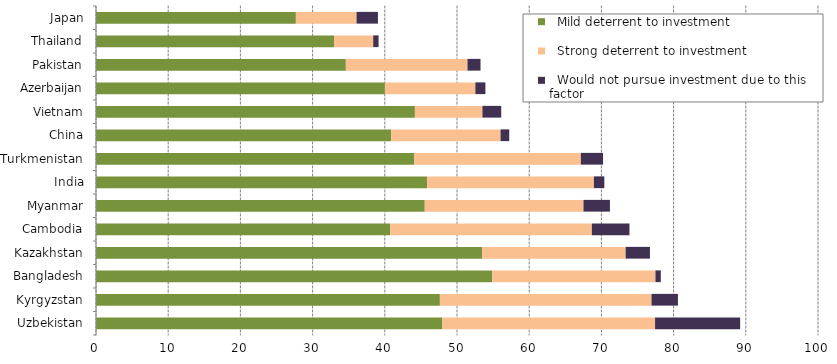
| Category |   Mild deterrent to investment |   Strong deterrent to investment |   Would not pursue investment due to this factor |
|---|---|---|---|
| Uzbekistan | 47.976 | 29.459 | 11.783 |
| Kyrgyzstan | 47.629 | 29.31 | 3.664 |
| Bangladesh | 54.869 | 22.615 | 0.741 |
| Kazakhstan | 53.513 | 19.846 | 3.367 |
| Cambodia | 40.733 | 27.945 | 5.21 |
| Myanmar | 45.536 | 21.983 | 3.664 |
| India | 45.856 | 23.108 | 1.444 |
| Turkmenistan | 44.086 | 23.068 | 3.076 |
| China | 40.882 | 15.15 | 1.202 |
| Vietnam | 44.167 | 9.354 | 2.605 |
| Azerbaijan | 40.015 | 12.526 | 1.392 |
| Pakistan | 34.602 | 16.85 | 1.805 |
| Thailand | 32.963 | 5.432 | 0.741 |
| Japan | 27.682 | 8.403 | 2.966 |